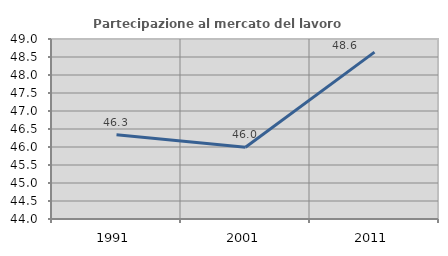
| Category | Partecipazione al mercato del lavoro  femminile |
|---|---|
| 1991.0 | 46.342 |
| 2001.0 | 45.994 |
| 2011.0 | 48.634 |